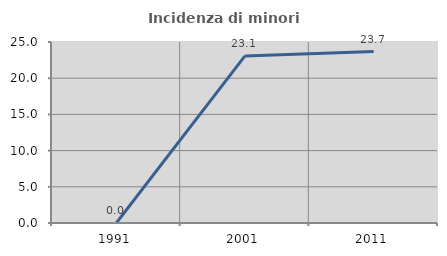
| Category | Incidenza di minori stranieri |
|---|---|
| 1991.0 | 0 |
| 2001.0 | 23.077 |
| 2011.0 | 23.684 |